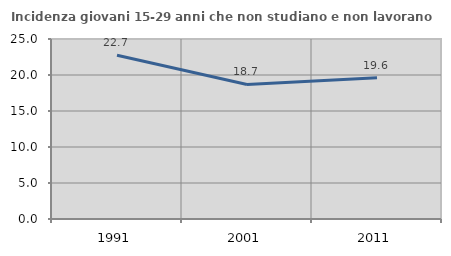
| Category | Incidenza giovani 15-29 anni che non studiano e non lavorano  |
|---|---|
| 1991.0 | 22.739 |
| 2001.0 | 18.692 |
| 2011.0 | 19.626 |